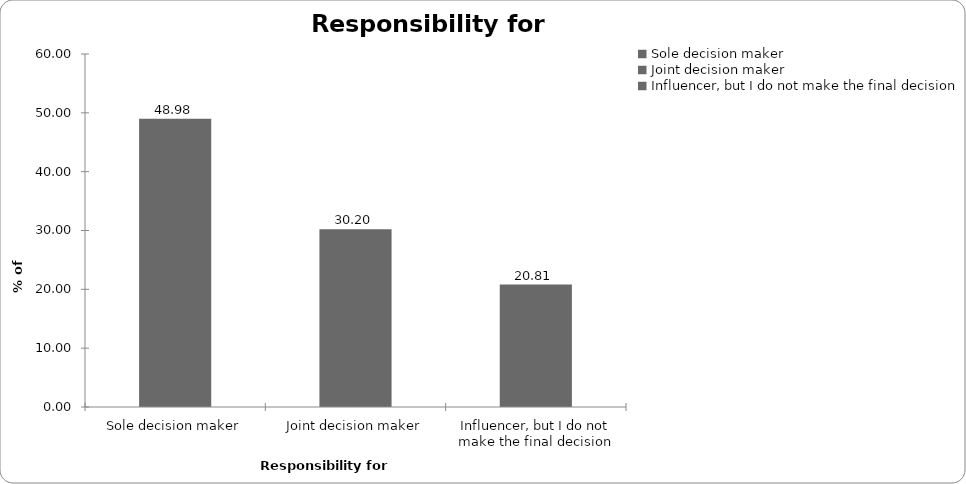
| Category | Responsibility for insurance |
|---|---|
| Sole decision maker | 48.982 |
| Joint decision maker | 30.204 |
| Influencer, but I do not make the final decision | 20.814 |